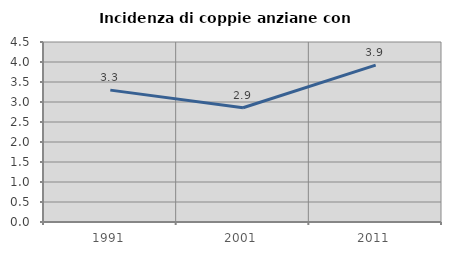
| Category | Incidenza di coppie anziane con figli |
|---|---|
| 1991.0 | 3.297 |
| 2001.0 | 2.857 |
| 2011.0 | 3.922 |